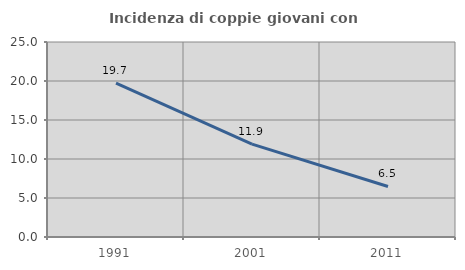
| Category | Incidenza di coppie giovani con figli |
|---|---|
| 1991.0 | 19.718 |
| 2001.0 | 11.913 |
| 2011.0 | 6.477 |